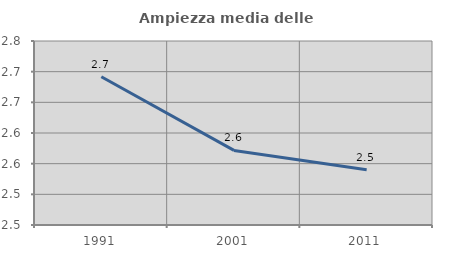
| Category | Ampiezza media delle famiglie |
|---|---|
| 1991.0 | 2.692 |
| 2001.0 | 2.572 |
| 2011.0 | 2.54 |